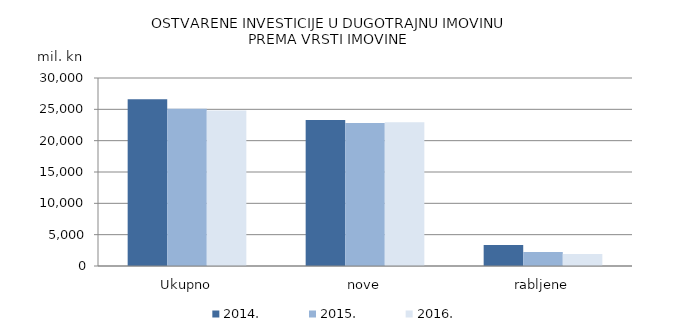
| Category | 2014. | 2015. | 2016. |
|---|---|---|---|
| Ukupno | 26625 | 25078 | 24830 |
| nove | 23291 | 22828 | 22925 |
| rabljene | 3334 | 2250 | 1905 |